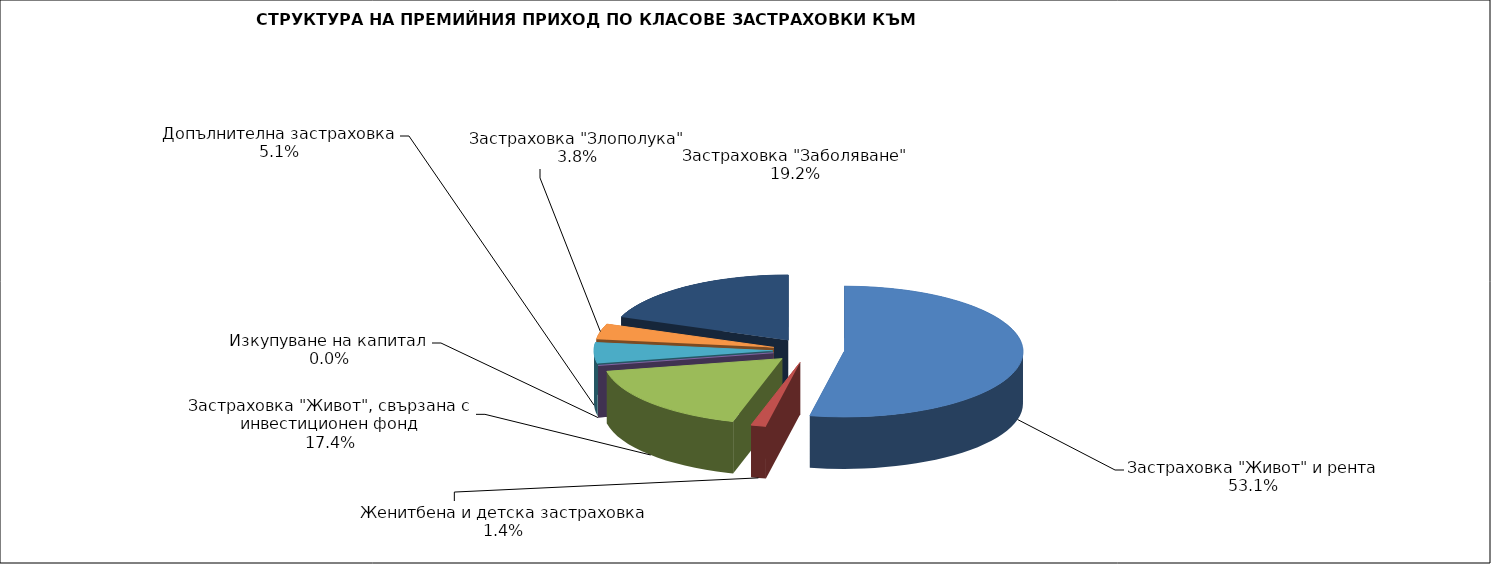
| Category | Series 0 |
|---|---|
| Застраховка "Живот" и рента | 27232829.16 |
| Женитбена и детска застраховка | 699582.187 |
| Застраховка "Живот", свързана с инвестиционен фонд | 8953301.239 |
| Изкупуване на капитал | 0 |
| Допълнителна застраховка | 2626740.334 |
| Застраховка "Злополука" | 1953054.21 |
| Застраховка "Заболяване" | 9851285.79 |